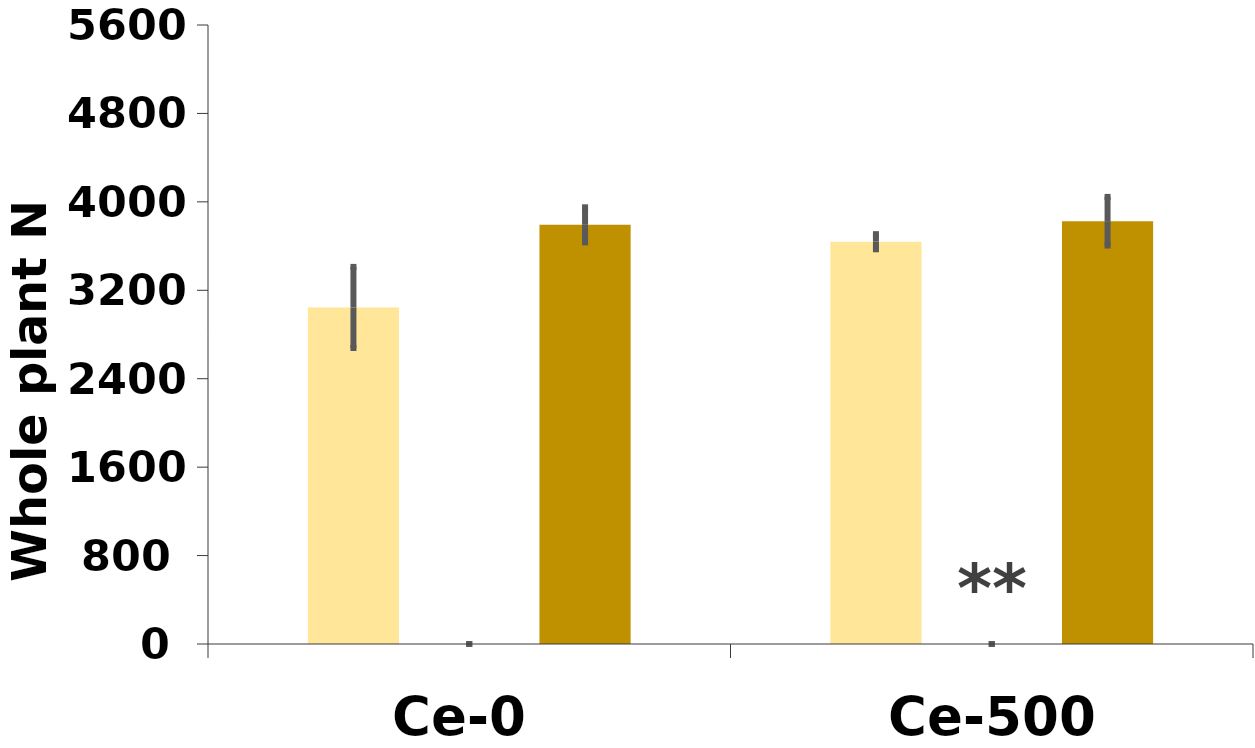
| Category | NH4NO3 | NH4+ | NO3- |
|---|---|---|---|
| Ce-0 | 3044.744 | 0 | 3792.391 |
| Ce-500 | 3639.399 | 0 | 3824.83 |